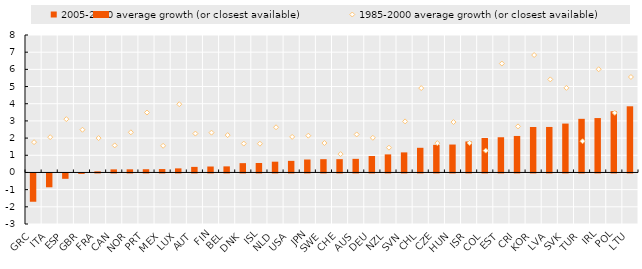
| Category | 2005-2020 average growth (or closest available) |
|---|---|
| GRC | -1.647 |
| ITA | -0.805 |
| ESP | -0.312 |
| GBR | -0.025 |
| FRA | 0.064 |
| CAN | 0.18 |
| NOR | 0.182 |
| PRT | 0.187 |
| MEX | 0.198 |
| LUX | 0.238 |
| AUT | 0.324 |
| FIN | 0.346 |
| BEL | 0.354 |
| DNK | 0.542 |
| ISL | 0.549 |
| NLD | 0.627 |
| USA | 0.675 |
| JPN | 0.754 |
| SWE | 0.773 |
| CHE | 0.774 |
| AUS | 0.792 |
| DEU | 0.959 |
| NZL | 1.052 |
| SVN | 1.168 |
| CHL | 1.435 |
| CZE | 1.607 |
| HUN | 1.625 |
| ISR | 1.802 |
| COL | 2.004 |
| EST | 2.049 |
| CRI | 2.124 |
| KOR | 2.647 |
| LVA | 2.648 |
| SVK | 2.844 |
| TUR | 3.122 |
| IRL | 3.166 |
| POL | 3.561 |
| LTU | 3.851 |